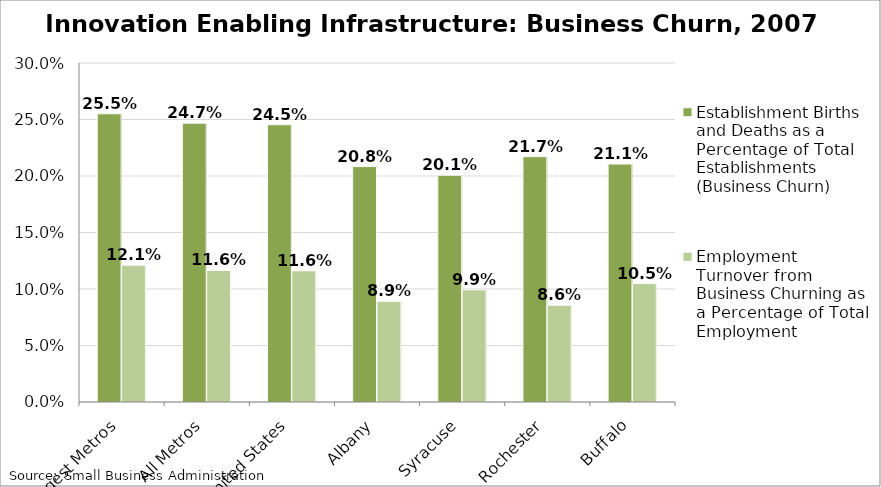
| Category | Establishment Births and Deaths as a Percentage of Total Establishments (Business Churn) | Employment Turnover from Business Churning as a Percentage of Total Employment |
|---|---|---|
| 100 Largest Metros | 0.255 | 0.121 |
| All Metros | 0.247 | 0.116 |
| United States | 0.245 | 0.116 |
| Albany | 0.208 | 0.089 |
| Syracuse | 0.201 | 0.099 |
| Rochester | 0.217 | 0.086 |
| Buffalo | 0.211 | 0.105 |